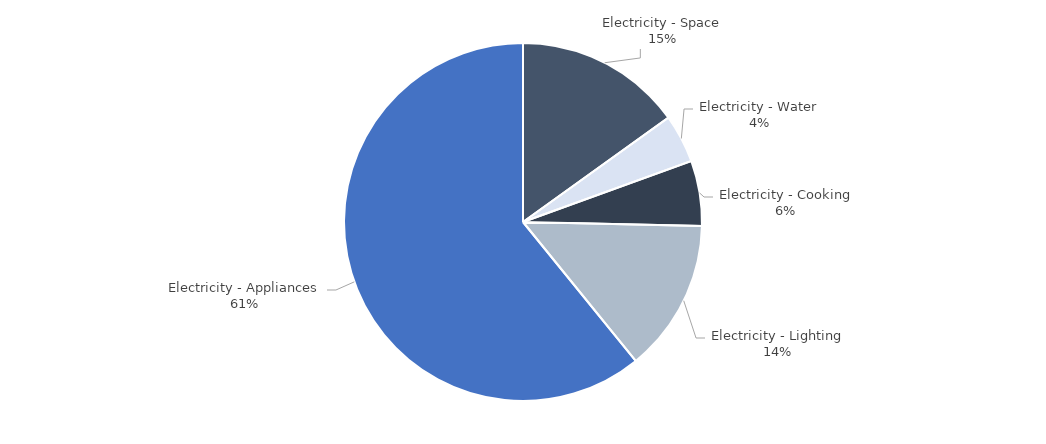
| Category | Series 0 |
|---|---|
|  Electricity - Space  | 1400.945 |
|  Electricity - Water  | 406.16 |
|  Electricity - Cooking  | 546.428 |
|  Electricity - Lighting  | 1280.861 |
|  Electricity - Appliances  | 5649.246 |